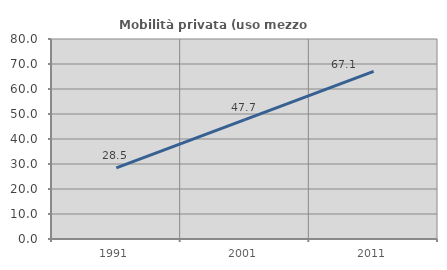
| Category | Mobilità privata (uso mezzo privato) |
|---|---|
| 1991.0 | 28.463 |
| 2001.0 | 47.74 |
| 2011.0 | 67.077 |